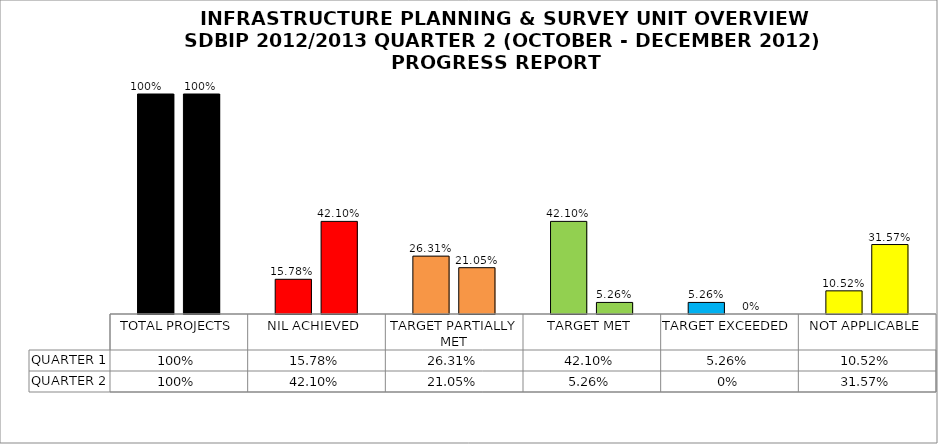
| Category | QUARTER 1 | QUARTER 2 |
|---|---|---|
| TOTAL PROJECTS | 1 | 1 |
| NIL ACHIEVED | 0.158 | 0.421 |
| TARGET PARTIALLY MET | 0.263 | 0.21 |
| TARGET MET | 0.421 | 0.053 |
| TARGET EXCEEDED | 0.053 | 0 |
| NOT APPLICABLE | 0.105 | 0.316 |